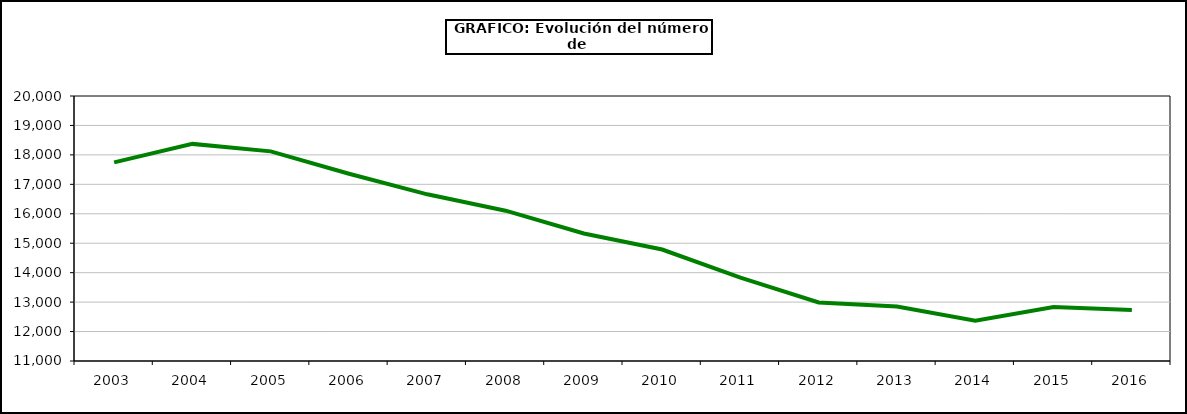
| Category | Lana |
|---|---|
| 2003.0 | 17744.754 |
| 2004.0 | 18373.709 |
| 2005.0 | 18119.109 |
| 2006.0 | 17360.572 |
| 2007.0 | 16660.647 |
| 2008.0 | 16105.475 |
| 2009.0 | 15330.854 |
| 2010.0 | 14786 |
| 2011.0 | 13830.488 |
| 2012.0 | 12986.682 |
| 2013.0 | 12849.185 |
| 2014.0 | 12369.399 |
| 2015.0 | 12834.9 |
| 2016.0 | 12731.005 |